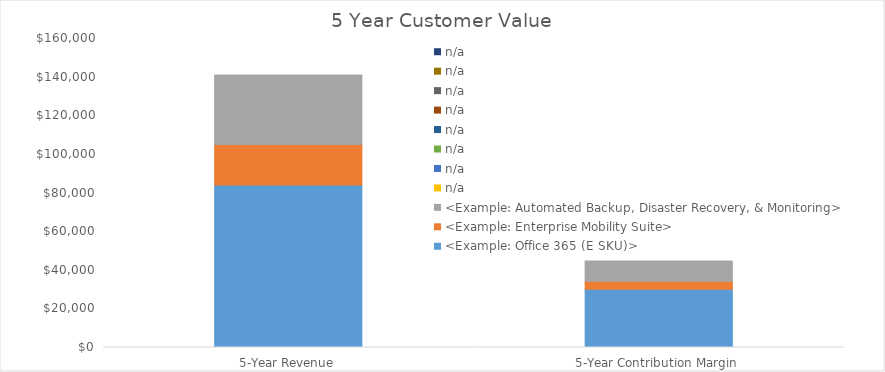
| Category | <Example: Office 365 (E SKU)> | <Example: Enterprise Mobility Suite> | <Example: Automated Backup, Disaster Recovery, & Monitoring> | n/a |
|---|---|---|---|---|
| 5-Year Revenue | 84200 | 20887.5 | 36031.25 | 0 |
| 5-Year Contribution Margin | 30190 | 4177.5 | 10408.854 | 0 |